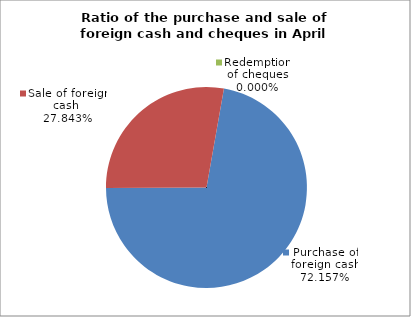
| Category | Purchase of foreign cash |
|---|---|
| 0 | 0.722 |
| 1 | 0.278 |
| 2 | 0 |